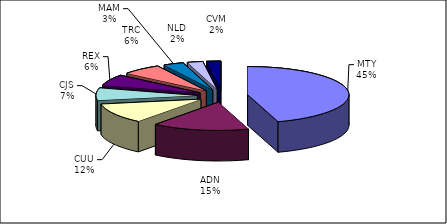
| Category | Series 0 |
|---|---|
| MTY | 135629 |
| ADN | 46441 |
| CUU | 34941 |
| CJS | 21414 |
| REX | 18943 |
| TRC | 19137 |
| MAM | 9663 |
| NLD | 7485 |
| CVM | 6769 |